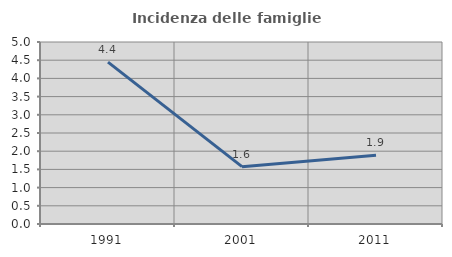
| Category | Incidenza delle famiglie numerose |
|---|---|
| 1991.0 | 4.447 |
| 2001.0 | 1.576 |
| 2011.0 | 1.889 |